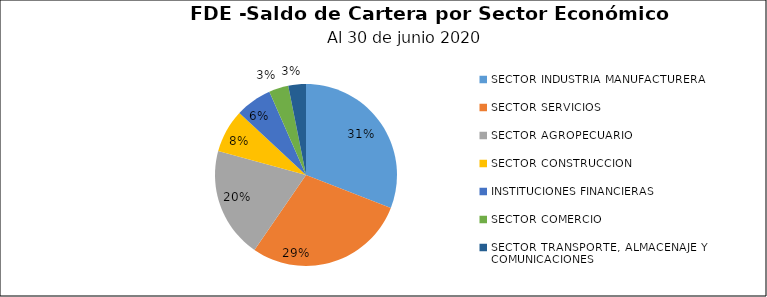
| Category | Saldo | Créditos |
|---|---|---|
| SECTOR INDUSTRIA MANUFACTURERA | 16.208 | 251 |
| SECTOR SERVICIOS | 15.04 | 193 |
| SECTOR AGROPECUARIO | 10.301 | 87 |
| SECTOR CONSTRUCCION | 4.035 | 15 |
| INSTITUCIONES FINANCIERAS | 3.4 | 9 |
| SECTOR COMERCIO | 1.82 | 174 |
| SECTOR TRANSPORTE, ALMACENAJE Y COMUNICACIONES | 1.64 | 8 |